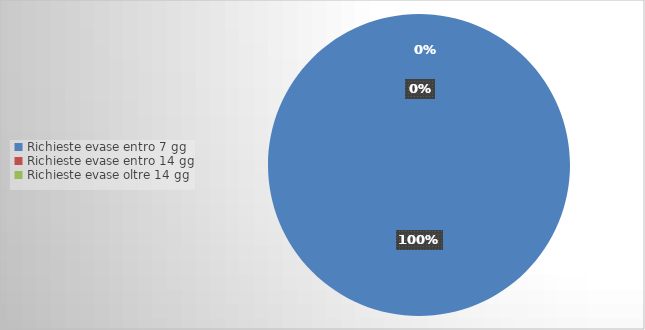
| Category | Series 0 |
|---|---|
| Richieste evase entro 7 gg | 24 |
| Richieste evase entro 14 gg | 0 |
| Richieste evase oltre 14 gg | 0 |